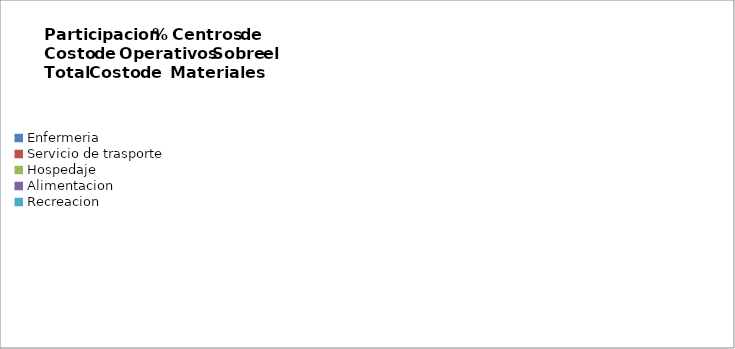
| Category | Series 7 |
|---|---|
| Enfermeria  | 0 |
| Servicio de trasporte | 0 |
| Hospedaje | 0 |
| Alimentacion | 0 |
| Recreacion  | 0 |